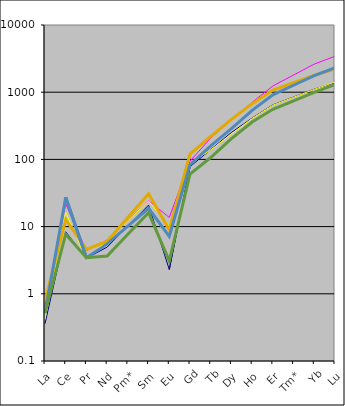
| Category | Series 0 | Series 1 | Series 2 | Series 3 | Series 4 | Series 5 |
|---|---|---|---|---|---|---|
| La | 0.359 | 0.664 | 0.419 | 0.784 | 0.514 | 0.522 |
| Ce | 8.362 | 21.789 | 16.345 | 12.77 | 27.33 | 7.7 |
| Pr | 3.379 | 4.381 | 3.228 | 4.583 | 3.451 | 3.45 |
| Nd | 4.955 | 6.335 | 6.261 | 6.079 | 5.526 | 3.655 |
| Pm* | 10.171 | 12.409 | 12.269 | 13.677 | 10.174 | 7.677 |
| Sm | 20.879 | 24.308 | 24.042 | 30.773 | 18.732 | 16.124 |
| Eu | 2.297 | 13.703 | 10.165 | 8.974 | 7.17 | 3.082 |
| Gd | 78.012 | 94.134 | 87.155 | 120.33 | 83.299 | 60.28 |
| Tb | 140.074 | 207.855 | 138.482 | 220.181 | 159.12 | 106.76 |
| Dy | 251.813 | 388.135 | 238.917 | 394.066 | 287.129 | 203.293 |
| Ho | 412.165 | 707.297 | 406.994 | 676.139 | 536.813 | 359.486 |
| Er | 647.084 | 1236.556 | 641.514 | 1075.007 | 913.152 | 556.964 |
| Tm* | 847.886 | 1800.691 | 841.311 | 1386.628 | 1269.289 | 745.209 |
| Yb | 1111.002 | 2622.194 | 1103.333 | 1788.58 | 1764.323 | 997.078 |
| Lu | 1390.475 | 3426.565 | 1417.161 | 2227.301 | 2309.274 | 1296.685 |